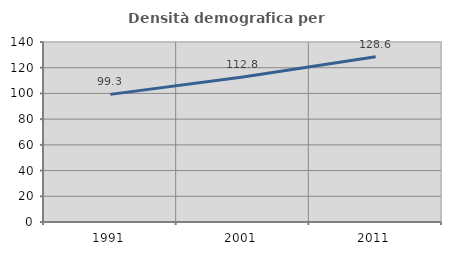
| Category | Densità demografica |
|---|---|
| 1991.0 | 99.264 |
| 2001.0 | 112.759 |
| 2011.0 | 128.578 |